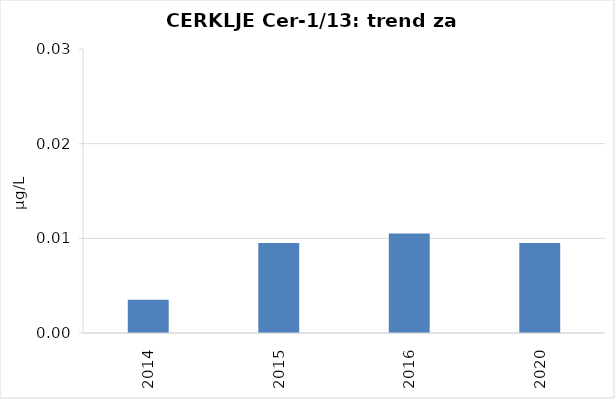
| Category | Vsota |
|---|---|
| 2014 | 0.004 |
| 2015 | 0.01 |
| 2016 | 0.01 |
| 2020 | 0.01 |